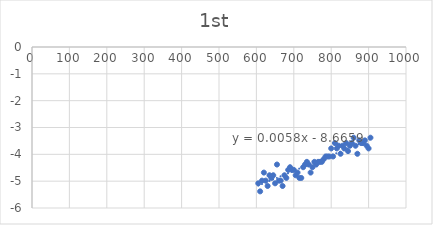
| Category | Series 0 |
|---|---|
| 605.0 | -5.08 |
| 610.0 | -5.38 |
| 615.0 | -4.98 |
| 620.0 | -4.68 |
| 625.0 | -4.98 |
| 630.0 | -5.18 |
| 635.0 | -4.78 |
| 640.0 | -4.88 |
| 645.0 | -4.78 |
| 650.0 | -5.08 |
| 655.0 | -4.38 |
| 660.0 | -4.98 |
| 665.0 | -4.98 |
| 670.0 | -5.18 |
| 675.0 | -4.78 |
| 680.0 | -4.88 |
| 685.0 | -4.58 |
| 690.0 | -4.48 |
| 695.0 | -4.58 |
| 700.0 | -4.58 |
| 705.0 | -4.78 |
| 710.0 | -4.68 |
| 715.0 | -4.88 |
| 720.0 | -4.88 |
| 725.0 | -4.48 |
| 730.0 | -4.38 |
| 735.0 | -4.28 |
| 740.0 | -4.38 |
| 745.0 | -4.68 |
| 750.0 | -4.48 |
| 755.0 | -4.28 |
| 760.0 | -4.38 |
| 765.0 | -4.28 |
| 770.0 | -4.28 |
| 775.0 | -4.28 |
| 780.0 | -4.18 |
| 785.0 | -4.08 |
| 790.0 | -4.08 |
| 795.0 | -4.08 |
| 800.0 | -3.78 |
| 805.0 | -4.08 |
| 810.0 | -3.58 |
| 815.0 | -3.78 |
| 820.0 | -3.68 |
| 825.0 | -3.98 |
| 830.0 | -3.68 |
| 835.0 | -3.78 |
| 840.0 | -3.58 |
| 845.0 | -3.88 |
| 850.0 | -3.68 |
| 855.0 | -3.58 |
| 860.0 | -3.38 |
| 865.0 | -3.68 |
| 870.0 | -3.98 |
| 875.0 | -3.48 |
| 880.0 | -3.58 |
| 885.0 | -3.58 |
| 890.0 | -3.48 |
| 895.0 | -3.68 |
| 900.0 | -3.78 |
| 905.0 | -3.38 |